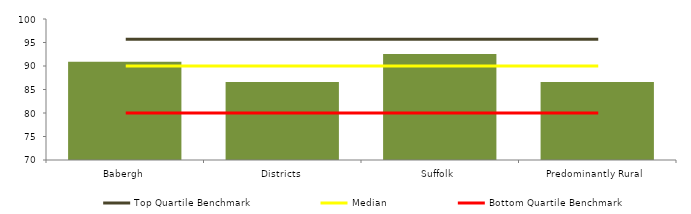
| Category | Block Data |
|---|---|
| Babergh | 90.909 |
| Districts | 86.595 |
| Suffolk | 92.555 |
|  Predominantly Rural   | 86.589 |